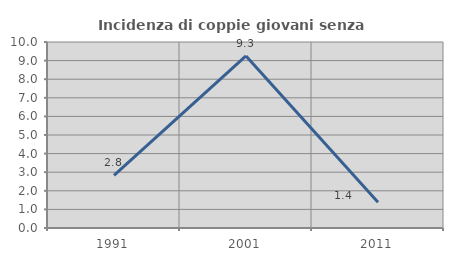
| Category | Incidenza di coppie giovani senza figli |
|---|---|
| 1991.0 | 2.83 |
| 2001.0 | 9.251 |
| 2011.0 | 1.389 |